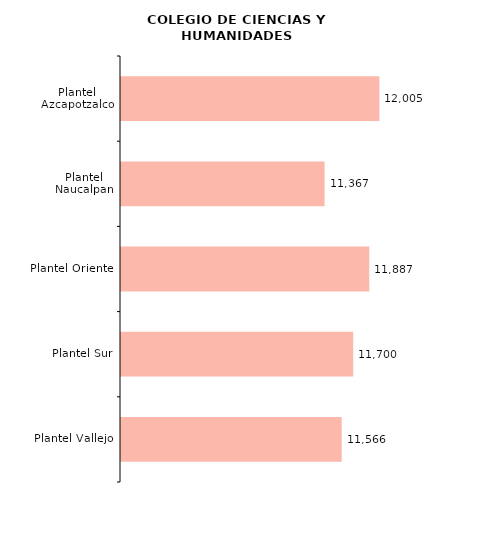
| Category | Series 0 |
|---|---|
| Plantel Vallejo | 11566 |
| Plantel Sur | 11700 |
| Plantel Oriente | 11887 |
| Plantel Naucalpan | 11367 |
| Plantel Azcapotzalco | 12005 |